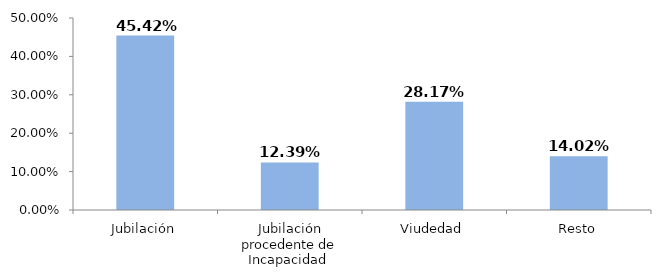
| Category | Series 0 |
|---|---|
| Jubilación | 0.454 |
| Jubilación procedente de Incapacidad  | 0.124 |
| Viudedad | 0.282 |
| Resto | 0.14 |